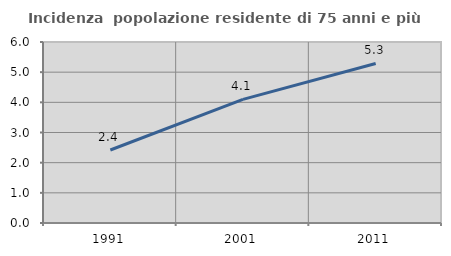
| Category | Incidenza  popolazione residente di 75 anni e più |
|---|---|
| 1991.0 | 2.419 |
| 2001.0 | 4.098 |
| 2011.0 | 5.289 |